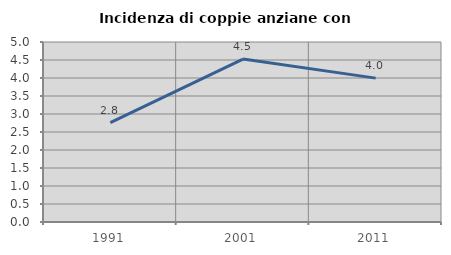
| Category | Incidenza di coppie anziane con figli |
|---|---|
| 1991.0 | 2.758 |
| 2001.0 | 4.526 |
| 2011.0 | 3.996 |